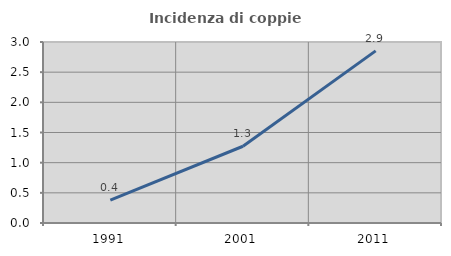
| Category | Incidenza di coppie miste |
|---|---|
| 1991.0 | 0.379 |
| 2001.0 | 1.272 |
| 2011.0 | 2.853 |